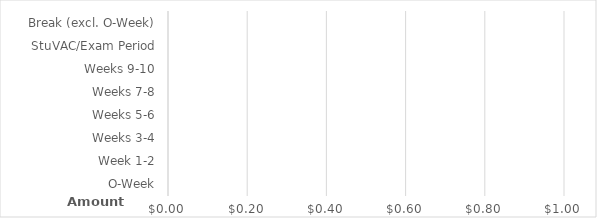
| Category | Amount |
|---|---|
| O-Week | 0 |
| Week 1-2 | 0 |
| Weeks 3-4 | 0 |
| Weeks 5-6 | 0 |
| Weeks 7-8 | 0 |
| Weeks 9-10 | 0 |
| StuVAC/Exam Period | 0 |
| Break (excl. O-Week) | 0 |